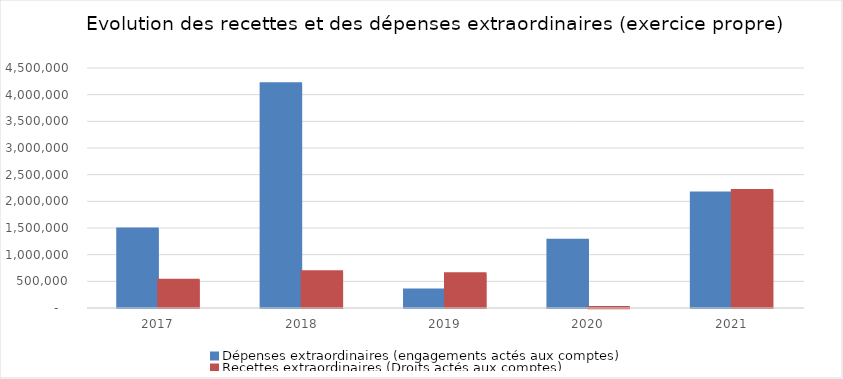
| Category | Dépenses extraordinaires (engagements actés aux comptes) | Recettes extraordinaires (Droits actés aux comptes) |
|---|---|---|
| 2017.0 | 1481025.32 | 520727.51 |
| 2018.0 | 4204455.41 | 679131.51 |
| 2019.0 | 335646.25 | 640965.33 |
| 2020.0 | 1269070.2 | 5660.02 |
| 2021.0 | 2157046.6 | 2203257.34 |